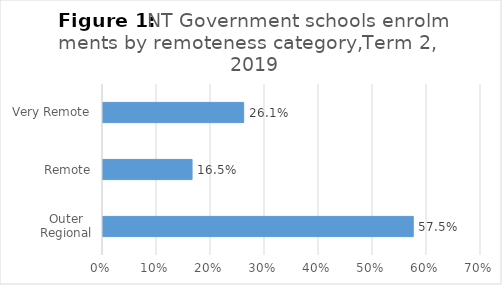
| Category | Term 2 Enrolment |
|---|---|
| Outer Regional | 0.575 |
| Remote | 0.165 |
| Very Remote | 0.261 |